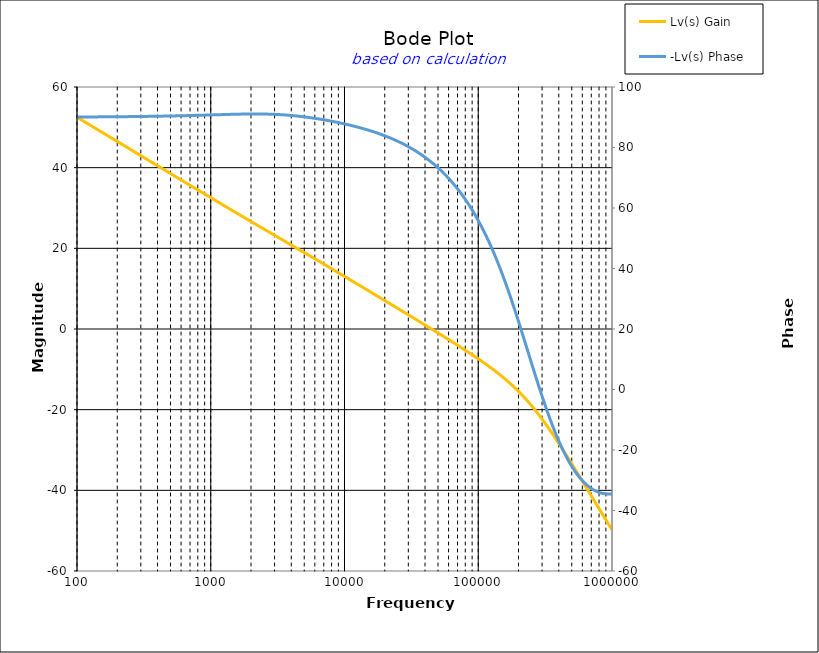
| Category | Lv(s) Gain |
|---|---|
| 100.0 | 52.51 |
| 104.71285480508996 | 52.111 |
| 109.64781961431851 | 51.711 |
| 114.81536214968828 | 51.311 |
| 120.2264434617413 | 50.911 |
| 125.89254117941672 | 50.511 |
| 131.82567385564073 | 50.111 |
| 138.0384264602885 | 49.711 |
| 144.54397707459273 | 49.311 |
| 151.35612484362082 | 48.911 |
| 158.48931924611136 | 48.511 |
| 165.95869074375605 | 48.111 |
| 173.78008287493756 | 47.712 |
| 181.97008586099835 | 47.312 |
| 190.54607179632475 | 46.912 |
| 199.526231496888 | 46.512 |
| 208.92961308540396 | 46.112 |
| 218.77616239495526 | 45.713 |
| 229.08676527677733 | 45.313 |
| 239.8832919019491 | 44.913 |
| 251.18864315095806 | 44.513 |
| 263.0267991895382 | 44.114 |
| 275.4228703338166 | 43.714 |
| 288.4031503126606 | 43.315 |
| 301.9951720402017 | 42.915 |
| 316.22776601683796 | 42.515 |
| 331.13112148259114 | 42.116 |
| 346.7368504525317 | 41.717 |
| 363.0780547701014 | 41.317 |
| 380.1893963205612 | 40.918 |
| 398.10717055349727 | 40.519 |
| 416.8693834703355 | 40.119 |
| 436.515832240166 | 39.72 |
| 457.0881896148751 | 39.321 |
| 478.6300923226384 | 38.922 |
| 501.18723362727235 | 38.524 |
| 524.8074602497726 | 38.125 |
| 549.5408738576245 | 37.726 |
| 575.4399373371572 | 37.328 |
| 602.559586074358 | 36.929 |
| 630.9573444801935 | 36.531 |
| 660.6934480075963 | 36.133 |
| 691.8309709189367 | 35.735 |
| 724.4359600749902 | 35.338 |
| 758.5775750291838 | 34.94 |
| 794.3282347242817 | 34.543 |
| 831.7637711026711 | 34.146 |
| 870.9635899560808 | 33.749 |
| 912.0108393559099 | 33.353 |
| 954.9925860214358 | 32.956 |
| 1000.0 | 32.561 |
| 1047.1285480509 | 32.165 |
| 1096.4781961431854 | 31.77 |
| 1148.1536214968835 | 31.375 |
| 1202.2644346174134 | 30.98 |
| 1258.925411794168 | 30.586 |
| 1318.2567385564075 | 30.193 |
| 1380.3842646028857 | 29.799 |
| 1445.4397707459275 | 29.407 |
| 1513.5612484362086 | 29.014 |
| 1584.8931924611136 | 28.623 |
| 1659.5869074375614 | 28.231 |
| 1737.8008287493756 | 27.84 |
| 1819.7008586099842 | 27.45 |
| 1905.4607179632476 | 27.06 |
| 1995.2623149688804 | 26.671 |
| 2089.29613085404 | 26.282 |
| 2187.7616239495537 | 25.893 |
| 2290.867652767774 | 25.505 |
| 2398.832919019492 | 25.117 |
| 2511.886431509581 | 24.73 |
| 2630.2679918953822 | 24.343 |
| 2754.2287033381667 | 23.956 |
| 2884.0315031266064 | 23.57 |
| 3019.9517204020162 | 23.183 |
| 3162.2776601683804 | 22.797 |
| 3311.311214825913 | 22.411 |
| 3467.368504525318 | 22.025 |
| 3630.7805477010156 | 21.638 |
| 3801.893963205614 | 21.252 |
| 3981.0717055349755 | 20.865 |
| 4168.693834703356 | 20.478 |
| 4365.158322401663 | 20.091 |
| 4570.881896148753 | 19.704 |
| 4786.300923226386 | 19.316 |
| 5011.872336272724 | 18.928 |
| 5248.074602497729 | 18.539 |
| 5495.408738576247 | 18.15 |
| 5754.39937337157 | 17.76 |
| 6025.595860743582 | 17.37 |
| 6309.573444801937 | 16.979 |
| 6606.934480075963 | 16.588 |
| 6918.309709189366 | 16.197 |
| 7244.359600749906 | 15.804 |
| 7585.775750291843 | 15.412 |
| 7943.28234724282 | 15.019 |
| 8317.637711026713 | 14.625 |
| 8709.635899560808 | 14.231 |
| 9120.108393559098 | 13.837 |
| 9549.925860214365 | 13.442 |
| 10000.0 | 13.047 |
| 10471.285480508997 | 12.651 |
| 10964.781961431861 | 12.255 |
| 11481.536214968835 | 11.858 |
| 12022.644346174135 | 11.461 |
| 12589.254117941677 | 11.064 |
| 13182.567385564085 | 10.667 |
| 13803.842646028861 | 10.269 |
| 14454.397707459284 | 9.871 |
| 15135.612484362091 | 9.473 |
| 15848.931924611154 | 9.074 |
| 16595.869074375623 | 8.675 |
| 17378.00828749377 | 8.276 |
| 18197.008586099848 | 7.876 |
| 19054.607179632498 | 7.476 |
| 19952.623149688818 | 7.076 |
| 20892.961308540394 | 6.676 |
| 21877.616239495524 | 6.275 |
| 22908.676527677744 | 5.875 |
| 23988.329190194912 | 5.473 |
| 25118.864315095805 | 5.072 |
| 26302.679918953818 | 4.67 |
| 27542.287033381683 | 4.268 |
| 28840.315031266073 | 3.865 |
| 30199.51720402017 | 3.462 |
| 31622.776601683825 | 3.059 |
| 33113.11214825913 | 2.655 |
| 34673.68504525318 | 2.251 |
| 36307.80547701015 | 1.846 |
| 38018.939632056165 | 1.441 |
| 39810.71705534976 | 1.035 |
| 41686.938347033574 | 0.628 |
| 43651.58322401662 | 0.221 |
| 45708.81896148756 | -0.188 |
| 47863.00923226389 | -0.597 |
| 50118.723362727265 | -1.007 |
| 52480.74602497729 | -1.418 |
| 54954.087385762534 | -1.831 |
| 57543.99373371576 | -2.245 |
| 60255.95860743583 | -2.66 |
| 63095.73444801938 | -3.077 |
| 66069.34480075965 | -3.497 |
| 69183.09709189367 | -3.918 |
| 72443.59600749903 | -4.341 |
| 75857.75750291838 | -4.768 |
| 79432.82347242821 | -5.197 |
| 83176.37711026715 | -5.629 |
| 87096.3589956081 | -6.066 |
| 91201.08393559098 | -6.506 |
| 95499.25860214367 | -6.951 |
| 100000.0 | -7.402 |
| 104712.85480509 | -7.858 |
| 109647.81961431864 | -8.321 |
| 114815.3621496884 | -8.792 |
| 120226.44346174138 | -9.271 |
| 125892.5411794168 | -9.759 |
| 131825.6738556409 | -10.258 |
| 138038.42646028864 | -10.768 |
| 144543.9770745929 | -11.291 |
| 151356.12484362093 | -11.828 |
| 158489.31924611155 | -12.38 |
| 165958.69074375625 | -12.95 |
| 173780.0828749377 | -13.538 |
| 181970.08586099852 | -14.147 |
| 190546.071796325 | -14.777 |
| 199526.2314968882 | -15.429 |
| 208929.6130854042 | -16.106 |
| 218776.1623949553 | -16.808 |
| 229086.7652767775 | -17.536 |
| 239883.29190194918 | -18.291 |
| 251188.64315095812 | -19.072 |
| 263026.79918953823 | -19.881 |
| 275422.8703338169 | -20.716 |
| 288403.1503126608 | -21.577 |
| 301995.1720402018 | -22.464 |
| 316227.766016838 | -23.375 |
| 331131.12148259114 | -24.309 |
| 346736.85045253224 | -25.264 |
| 363078.0547701019 | -26.239 |
| 380189.3963205617 | -27.232 |
| 398107.1705534977 | -28.242 |
| 416869.38347033586 | -29.266 |
| 436515.8322401663 | -30.304 |
| 457088.1896148753 | -31.354 |
| 478630.0923226385 | -32.413 |
| 501187.23362727324 | -33.481 |
| 524807.4602497736 | -34.556 |
| 549540.8738576254 | -35.637 |
| 575439.9373371577 | -36.723 |
| 602559.5860743586 | -37.812 |
| 630957.3444801938 | -38.904 |
| 660693.4480075965 | -39.997 |
| 691830.9709189369 | -41.091 |
| 724435.9600749904 | -42.185 |
| 758577.5750291839 | -43.277 |
| 794328.2347242816 | -44.368 |
| 831763.7711026709 | -45.456 |
| 870963.5899560819 | -46.541 |
| 912010.8393559109 | -47.622 |
| 954992.586021437 | -48.698 |
| 1000000.0 | -49.769 |